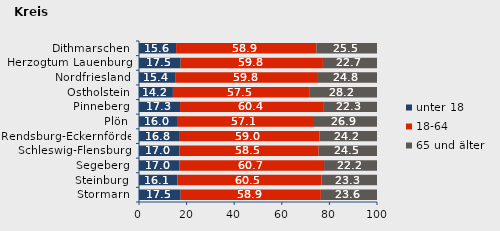
| Category | unter 18 | 18-64 | 65 und älter |
|---|---|---|---|
| Stormarn | 17.509 | 58.906 | 23.585 |
| Steinburg | 16.145 | 60.516 | 23.339 |
| Segeberg | 17.047 | 60.706 | 22.247 |
| Schleswig-Flensburg | 16.954 | 58.537 | 24.509 |
| Rendsburg-Eckernförde | 16.831 | 59.014 | 24.156 |
| Plön | 15.968 | 57.134 | 26.898 |
| Pinneberg | 17.253 | 60.424 | 22.323 |
| Ostholstein | 14.246 | 57.532 | 28.222 |
| Nordfriesland | 15.426 | 59.77 | 24.804 |
| Herzogtum Lauenburg | 17.496 | 59.785 | 22.719 |
| Dithmarschen | 15.586 | 58.943 | 25.471 |